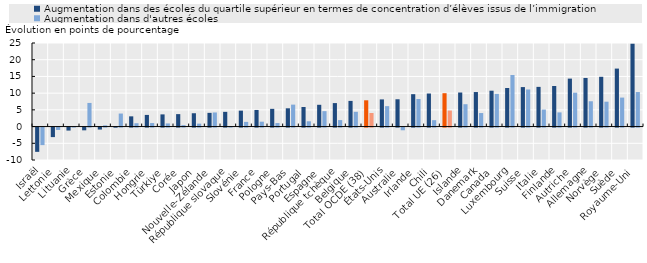
| Category | Augmentation dans des écoles du quartile supérieur en termes de concentration d’élèves issus de l’immigration  | Augmentation dans d'autres écoles |
|---|---|---|
| Israël | -7.261 | -5.249 |
| Lettonie | -2.852 | -0.708 |
| Lituanie | -0.894 | 0.04 |
| Grèce | -0.822 | 7.07 |
| Mexique | -0.592 | 0.365 |
| Estonie | -0.031 | 3.898 |
| Colombie | 3.06 | 0.997 |
| Hongrie | 3.486 | 1.052 |
| Türkiye | 3.645 | 0.935 |
| Corée | 3.724 | 0.438 |
| Japon | 3.989 | 0.878 |
| Nouvelle-Zélande | 4.103 | 4.22 |
| République slovaque | 4.403 | 0.078 |
| Slovénie | 4.767 | 1.403 |
| France | 4.968 | 1.46 |
| Pologne | 5.303 | 1.048 |
| Pays-Bas | 5.465 | 6.565 |
| Portugal | 5.853 | 1.582 |
| Espagne | 6.515 | 4.617 |
| République tchèque | 7.025 | 1.938 |
| Belgique | 7.679 | 4.419 |
| Total OCDE (38) | 7.86 | 4.06 |
| États-Unis | 8.125 | 6.111 |
| Australie | 8.168 | -0.81 |
| Irlande | 9.69 | 8.246 |
| Chili | 9.889 | 1.916 |
| Total UE (26) | 9.982 | 4.806 |
| Islande | 10.189 | 6.691 |
| Danemark | 10.329 | 4.048 |
| Canada | 10.729 | 9.779 |
| Luxembourg | 11.538 | 15.436 |
| Suisse | 11.812 | 11.096 |
| Italie | 11.876 | 5.089 |
| Finlande | 12.145 | 4.242 |
| Autriche | 14.346 | 10.141 |
| Allemagne | 14.541 | 7.571 |
| Norvège | 14.894 | 7.446 |
| Suède | 17.346 | 8.673 |
| Royaume-Uni | 24.781 | 10.33 |